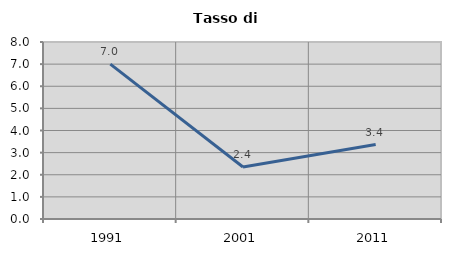
| Category | Tasso di disoccupazione   |
|---|---|
| 1991.0 | 7.002 |
| 2001.0 | 2.353 |
| 2011.0 | 3.364 |